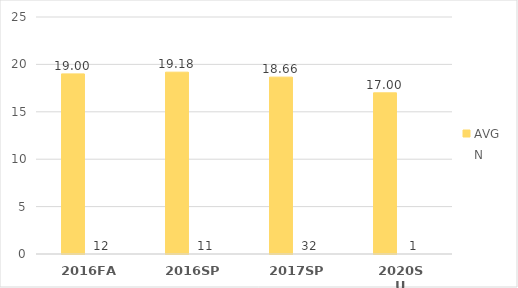
| Category | AVG | N |
|---|---|---|
| 2016FA | 19 | 12 |
| 2016SP | 19.182 | 11 |
| 2017SP | 18.656 | 32 |
| 2020SU | 17 | 1 |